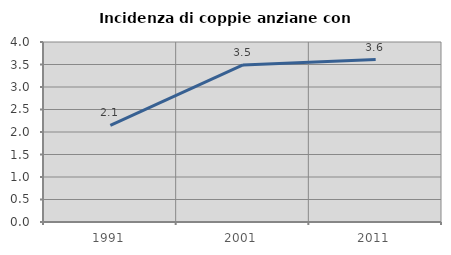
| Category | Incidenza di coppie anziane con figli |
|---|---|
| 1991.0 | 2.15 |
| 2001.0 | 3.492 |
| 2011.0 | 3.609 |